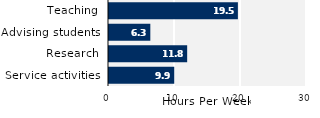
| Category | Series 0 |
|---|---|
| Service activities | 9.886 |
| Research | 11.843 |
| Advising students | 6.261 |
| Teaching | 19.529 |